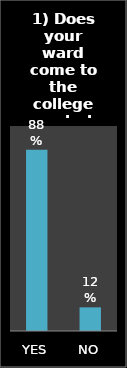
| Category | Series 0 |
|---|---|
| YES | 0.885 |
| NO | 0.115 |